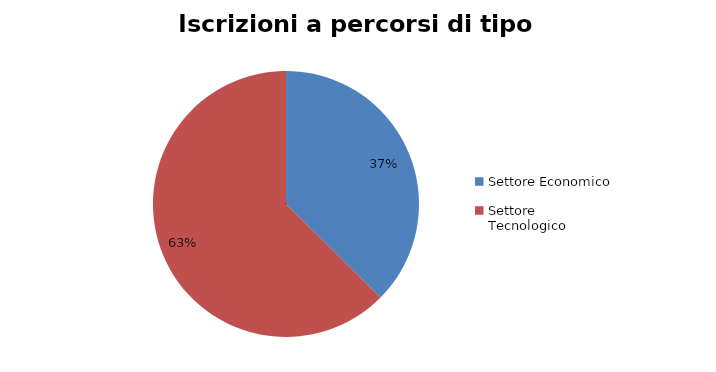
| Category | Series 0 |
|---|---|
| Settore Economico | 5068 |
| Settore Tecnologico | 8475 |